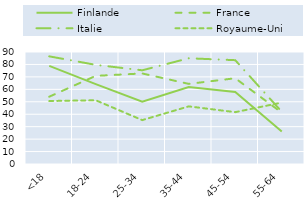
| Category | Finlande | France | Italie | Royaume-Uni |
|---|---|---|---|---|
| <18 | 78.84 | 54.09 | 86.5 | 50.61 |
| 18-24 | 64.18 | 70.82 | 79.67 | 51.22 |
| 25-34 | 50.03 | 72.76 | 75.3 | 35.27 |
| 35-44 | 61.91 | 64.38 | 84.96 | 46.31 |
| 45-54 | 57.94 | 68.9 | 83.43 | 41.67 |
| 55-64 | 26.12 | 41.27 | 41.99 | 49.34 |